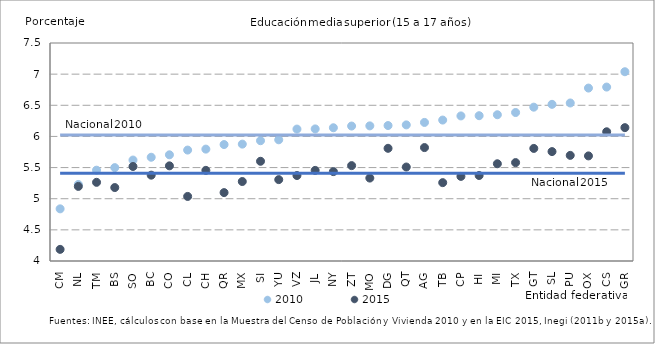
| Category | 2010 | 2015 | N_10 | N_15 |
|---|---|---|---|---|
| CM | 4.837 | 4.187 | 6.022 | 5.407 |
| NL | 5.228 | 5.198 | 6.022 | 5.407 |
| TM | 5.458 | 5.263 | 6.022 | 5.407 |
| BS | 5.499 | 5.179 | 6.022 | 5.407 |
| SO | 5.621 | 5.517 | 6.022 | 5.407 |
| BC | 5.666 | 5.378 | 6.022 | 5.407 |
| CO | 5.705 | 5.528 | 6.022 | 5.407 |
| CL | 5.781 | 5.037 | 6.022 | 5.407 |
| CH | 5.796 | 5.455 | 6.022 | 5.407 |
| QR | 5.869 | 5.098 | 6.022 | 5.407 |
| MX | 5.876 | 5.276 | 6.022 | 5.407 |
| SI | 5.932 | 5.601 | 6.022 | 5.407 |
| YU | 5.946 | 5.307 | 6.022 | 5.407 |
| VZ | 6.118 | 5.372 | 6.022 | 5.407 |
| JL | 6.121 | 5.455 | 6.022 | 5.407 |
| NY | 6.14 | 5.436 | 6.022 | 5.407 |
| ZT | 6.167 | 5.531 | 6.022 | 5.407 |
| MO | 6.169 | 5.331 | 6.022 | 5.407 |
| DG | 6.175 | 5.809 | 6.022 | 5.407 |
| QT | 6.185 | 5.509 | 6.022 | 5.407 |
| AG | 6.224 | 5.821 | 6.022 | 5.407 |
| TB | 6.263 | 5.258 | 6.022 | 5.407 |
| CP | 6.329 | 5.358 | 6.022 | 5.407 |
| HI | 6.333 | 5.373 | 6.022 | 5.407 |
| MI | 6.348 | 5.561 | 6.022 | 5.407 |
| TX | 6.384 | 5.58 | 6.022 | 5.407 |
| GT | 6.47 | 5.808 | 6.022 | 5.407 |
| SL | 6.515 | 5.756 | 6.022 | 5.407 |
| PU | 6.537 | 5.696 | 6.022 | 5.407 |
| OX | 6.776 | 5.687 | 6.022 | 5.407 |
| CS | 6.792 | 6.075 | 6.022 | 5.407 |
| GR | 7.039 | 6.141 | 6.022 | 5.407 |